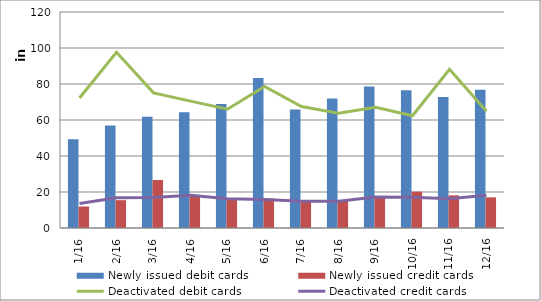
| Category | Newly issued debit cards | Newly issued credit cards |
|---|---|---|
| 2016-01-31 | 49362 | 11936 |
| 2016-02-28 | 56991 | 15457 |
| 2016-03-31 | 61790 | 26684 |
| 2016-04-30 | 64286 | 17362 |
| 2016-05-31 | 68855 | 16430 |
| 2016-06-30 | 83265 | 16395 |
| 2016-07-31 | 65871 | 14450 |
| 2016-08-31 | 71999 | 15345 |
| 2016-09-30 | 78563 | 16846 |
| 2016-10-31 | 76563 | 20188 |
| 2016-11-30 | 72731 | 18151 |
| 2016-12-31 | 76837 | 17025 |